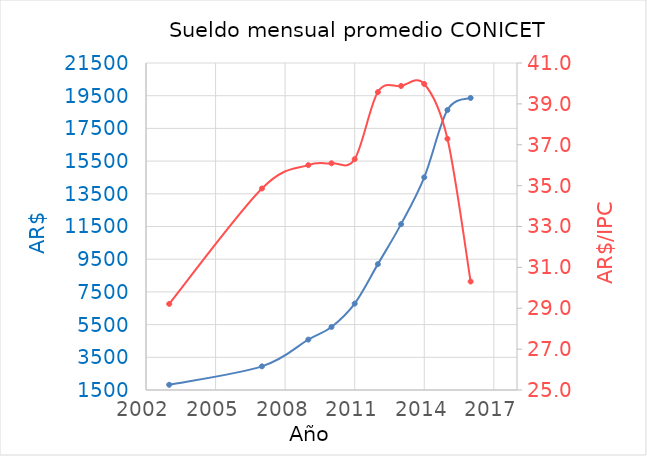
| Category | AR$ |
|---|---|
| 2003.0 | 1819.621 |
| 2007.0 | 2946.405 |
| 2009.0 | 4582.866 |
| 2010.0 | 5356.349 |
| 2011.0 | 6784.128 |
| 2012.0 | 9198.613 |
| 2013.0 | 11643.924 |
| 2014.0 | 14508.617 |
| 2015.0 | 18622.819 |
| 2016.0 | 19362.961 |